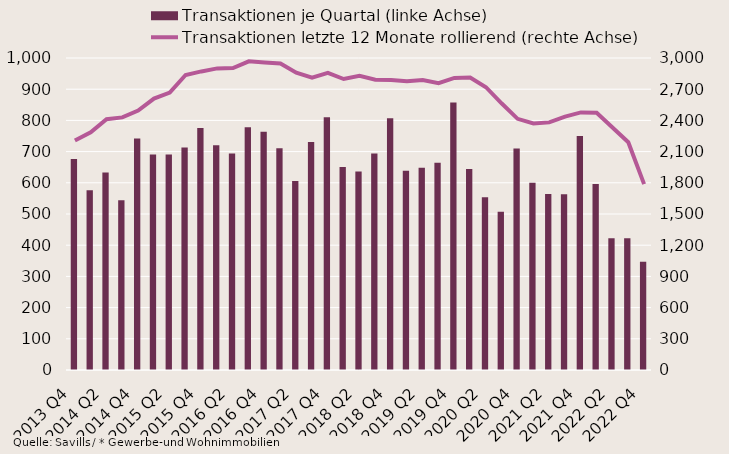
| Category | Transaktionen je Quartal (linke Achse) |
|---|---|
| 2013 Q4 | 676 |
| 2014 Q1 | 576 |
| 2014 Q2 | 633 |
| 2014 Q3 | 544 |
| 2014 Q4 | 742 |
| 2015 Q1 | 691 |
| 2015 Q2 | 691 |
| 2015 Q3 | 713 |
| 2015 Q4 | 776 |
| 2016 Q1 | 720 |
| 2016 Q2 | 694 |
| 2016 Q3 | 778 |
| 2016 Q4 | 764 |
| 2017 Q1 | 711 |
| 2017 Q2 | 606 |
| 2017 Q3 | 731 |
| 2017 Q4 | 810 |
| 2018 Q1 | 651 |
| 2018 Q2 | 636 |
| 2018 Q3 | 694 |
| 2018 Q4 | 807 |
| 2019 Q1 | 639 |
| 2019 Q2 | 648 |
| 2019 Q3 | 664 |
| 2019 Q4 | 857 |
| 2020 Q1 | 644 |
| 2020 Q2 | 554 |
| 2020 Q3 | 507 |
| 2020 Q4 | 710 |
| 2021 Q1 | 600 |
| 2021 Q2 | 564 |
| 2021 Q3 | 563 |
| 2021 Q4 | 750 |
| 2022 Q1 | 596 |
| 2022 Q2 | 422 |
| 2022 Q3 | 422 |
| 2022 Q4 | 347 |